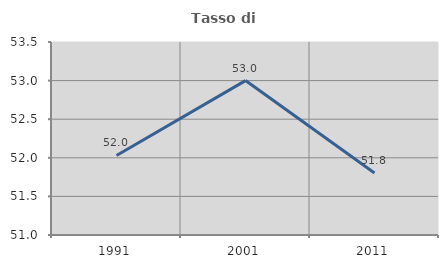
| Category | Tasso di occupazione   |
|---|---|
| 1991.0 | 52.03 |
| 2001.0 | 53 |
| 2011.0 | 51.803 |